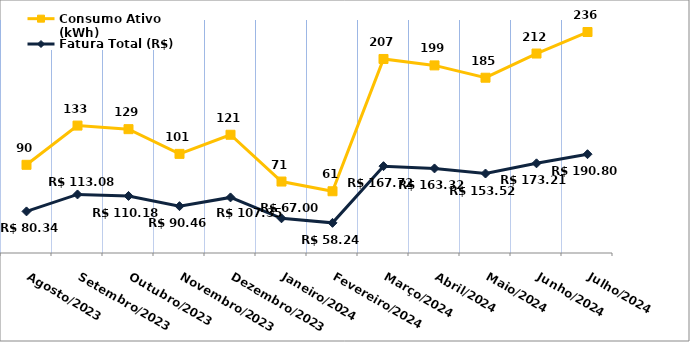
| Category | Fatura Total (R$) | Consumo Ativo (kWh) |
|---|---|---|
| Agosto/2023 | 80.34 | 90 |
| Setembro/2023 | 113.08 | 133 |
| Outubro/2023 | 110.18 | 129 |
| Novembro/2023 | 90.46 | 101 |
| Dezembro/2023 | 107.35 | 121 |
| Janeiro/2024 | 67 | 71 |
| Fevereiro/2024 | 58.24 | 61 |
| Março/2024 | 167.72 | 207 |
| Abril/2024 | 163.32 | 199 |
| Maio/2024 | 153.52 | 185 |
| Junho/2024 | 173.21 | 212 |
| Julho/2024 | 190.8 | 236 |